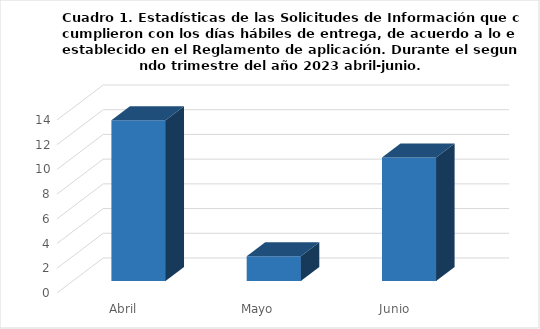
| Category | Series 0 |
|---|---|
| Abril | 13 |
| Mayo | 2 |
| Junio | 10 |